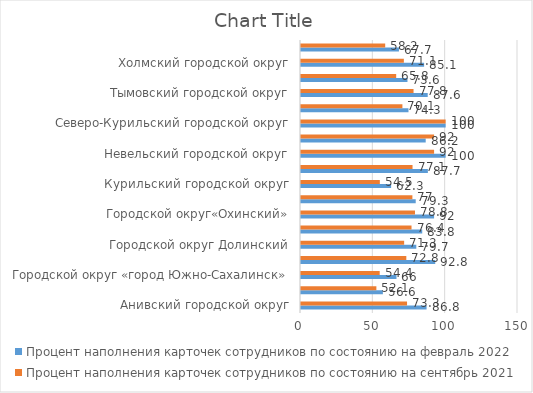
| Category | Процент наполнения карточек сотрудников по состоянию на февраль 2022 | Процент наполнения карточек сотрудников по состоянию на сентябрь 2021 |
|---|---|---|
| Анивский городской округ | 86.8 | 73.3 |
| Городской округ "Александровск-Сахалинский район" | 56.6 | 52.1 |
| Городской округ «город Южно-Сахалинск» | 66 | 54.4 |
| Городской округ «Смирныховский» | 92.8 | 72.8 |
| Городской округ Долинский | 79.7 | 71.3 |
| Городской округ Ногликский | 83.8 | 76.4 |
| Городской округ«Охинский» | 92 | 78.8 |
| Корсаковский городской округ | 79.3 | 77 |
| Курильский городской округ | 62.3 | 54.5 |
| Макаровский городской округ | 87.7 | 77.1 |
| Невельский городской округ | 100 | 92 |
| Поронайский городской округ | 86.2 | 92 |
| Северо-Курильский городской округ | 100 | 100 |
| Томаринский городской округ | 74.3 | 70.1 |
| Тымовский городской округ | 87.6 | 77.8 |
| Углегорский городской округ | 73.6 | 65.8 |
| Холмский городской округ | 85.1 | 71.1 |
| Южно-Курильский городской округ | 67.7 | 58.2 |